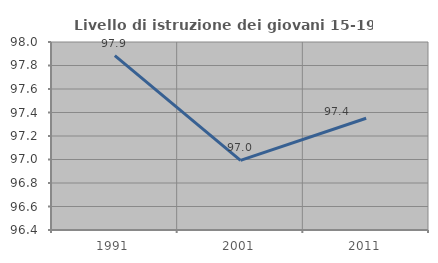
| Category | Livello di istruzione dei giovani 15-19 anni |
|---|---|
| 1991.0 | 97.884 |
| 2001.0 | 96.992 |
| 2011.0 | 97.351 |